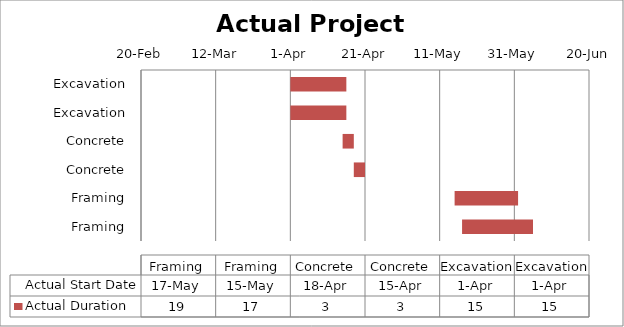
| Category | Actual Start Date | Actual Duration |
|---|---|---|
| Excavation | 2014-04-01 | 15 |
| Excavation | 2014-04-01 | 15 |
| Concrete | 2014-04-15 | 3 |
| Concrete | 2014-04-18 | 3 |
| Framing | 2014-05-15 | 17 |
| Framing | 2014-05-17 | 19 |